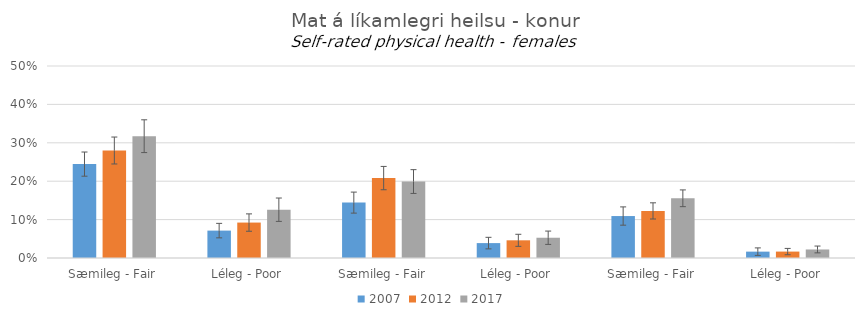
| Category | 2007 | 2012 | 2017 |
|---|---|---|---|
| 0 | 0.245 | 0.28 | 0.317 |
| 1 | 0.071 | 0.092 | 0.126 |
| 2 | 0.144 | 0.208 | 0.199 |
| 3 | 0.039 | 0.046 | 0.053 |
| 4 | 0.109 | 0.123 | 0.156 |
| 5 | 0.017 | 0.017 | 0.022 |